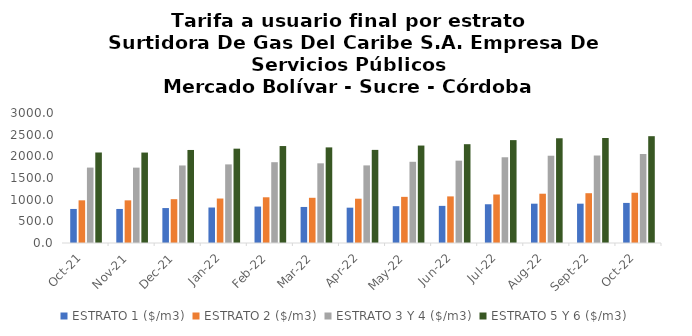
| Category | ESTRATO 1 ($/m3) | ESTRATO 2 ($/m3) | ESTRATO 3 Y 4 ($/m3) | ESTRATO 5 Y 6 ($/m3) |
|---|---|---|---|---|
| 2021-10-01 | 785.66 | 984.81 | 1740.51 | 2088.612 |
| 2021-11-01 | 785.55 | 984.37 | 1739.24 | 2087.088 |
| 2021-12-01 | 806.47 | 1011.33 | 1789.2 | 2147.04 |
| 2022-01-01 | 818.77 | 1026.2 | 1814.11 | 2176.932 |
| 2022-02-01 | 840.84 | 1054.98 | 1864.59 | 2237.508 |
| 2022-03-01 | 831.68 | 1043.33 | 1838.57 | 2206.284 |
| 2022-04-01 | 815.29 | 1022.06 | 1790.68 | 2148.816 |
| 2022-05-01 | 849.49 | 1064.9 | 1874.06 | 2248.872 |
| 2022-06-01 | 856.82 | 1075.55 | 1900.19 | 2280.228 |
| 2022-07-01 | 894.13 | 1119.13 | 1978.46 | 2374.152 |
| 2022-08-01 | 907.16 | 1137.37 | 2014.17 | 2417.004 |
| 2022-09-01 | 907.44 | 1149 | 2018.96 | 2422.8 |
| 2022-10-01 | 924.96 | 1159.68 | 2054.17 | 2465.004 |